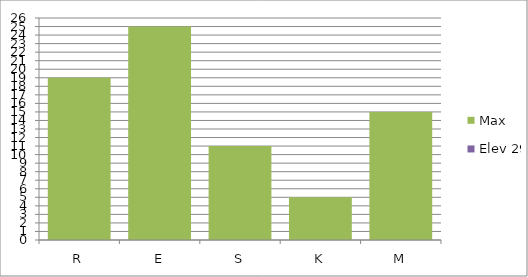
| Category | Max | Elev 29 |
|---|---|---|
| R | 19 | 0 |
| E | 25 | 0 |
| S | 11 | 0 |
| K | 5 | 0 |
| M | 15 | 0 |